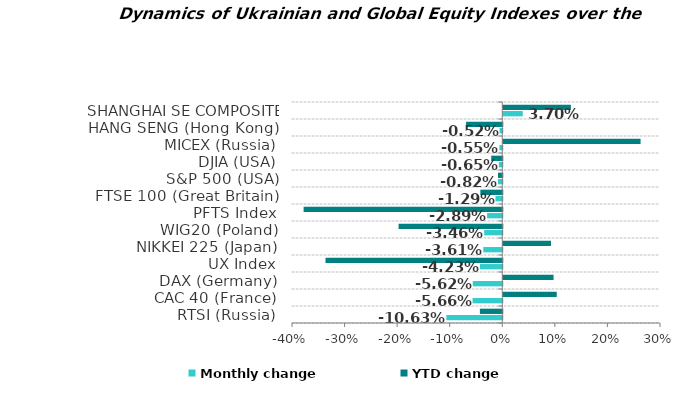
| Category | Monthly change | YTD change |
|---|---|---|
| RTSI (Russia) | -0.106 | -0.043 |
| CAC 40 (France) | -0.057 | 0.102 |
| DAX (Germany) | -0.056 | 0.096 |
| UX Index | -0.042 | -0.336 |
| NIKKEI 225 (Japan) | -0.036 | 0.091 |
| WIG20 (Poland) | -0.035 | -0.197 |
| PFTS Index | -0.029 | -0.378 |
| FTSE 100 (Great Britain) | -0.013 | -0.042 |
| S&P 500 (USA) | -0.008 | -0.008 |
| DJIA (USA) | -0.007 | -0.021 |
| MICEX (Russia) | -0.005 | 0.261 |
| HANG SENG (Hong Kong) | -0.005 | -0.069 |
| SHANGHAI SE COMPOSITE (China) | 0.037 | 0.129 |